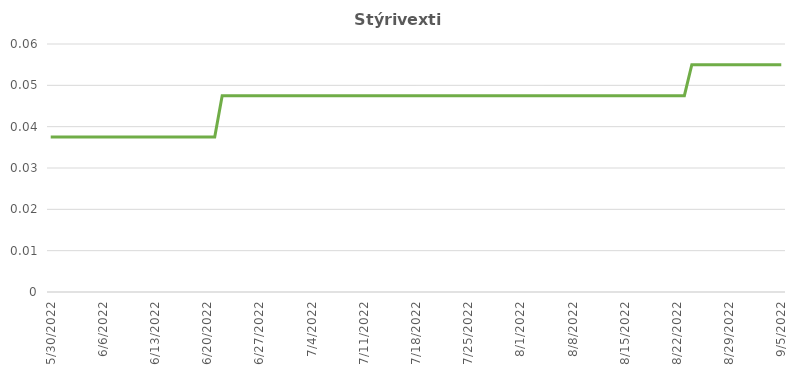
| Category | Stýrivextir |
|---|---|
| 9/5/22 | 0.055 |
| 9/2/22 | 0.055 |
| 9/1/22 | 0.055 |
| 8/31/22 | 0.055 |
| 8/30/22 | 0.055 |
| 8/29/22 | 0.055 |
| 8/26/22 | 0.055 |
| 8/25/22 | 0.055 |
| 8/24/22 | 0.055 |
| 8/23/22 | 0.048 |
| 8/22/22 | 0.048 |
| 8/19/22 | 0.048 |
| 8/18/22 | 0.048 |
| 8/17/22 | 0.048 |
| 8/16/22 | 0.048 |
| 8/15/22 | 0.048 |
| 8/12/22 | 0.048 |
| 8/11/22 | 0.048 |
| 8/10/22 | 0.048 |
| 8/9/22 | 0.048 |
| 8/8/22 | 0.048 |
| 8/5/22 | 0.048 |
| 8/4/22 | 0.048 |
| 8/3/22 | 0.048 |
| 8/2/22 | 0.048 |
| 7/29/22 | 0.048 |
| 7/28/22 | 0.048 |
| 7/27/22 | 0.048 |
| 7/26/22 | 0.048 |
| 7/25/22 | 0.048 |
| 7/22/22 | 0.048 |
| 7/21/22 | 0.048 |
| 7/20/22 | 0.048 |
| 7/19/22 | 0.048 |
| 7/18/22 | 0.048 |
| 7/15/22 | 0.048 |
| 7/14/22 | 0.048 |
| 7/13/22 | 0.048 |
| 7/12/22 | 0.048 |
| 7/11/22 | 0.048 |
| 7/8/22 | 0.048 |
| 7/7/22 | 0.048 |
| 7/6/22 | 0.048 |
| 7/5/22 | 0.048 |
| 7/4/22 | 0.048 |
| 7/1/22 | 0.048 |
| 6/30/22 | 0.048 |
| 6/29/22 | 0.048 |
| 6/28/22 | 0.048 |
| 6/27/22 | 0.048 |
| 6/24/22 | 0.048 |
| 6/23/22 | 0.048 |
| 6/22/22 | 0.048 |
| 6/21/22 | 0.038 |
| 6/20/22 | 0.038 |
| 6/16/22 | 0.038 |
| 6/15/22 | 0.038 |
| 6/14/22 | 0.038 |
| 6/13/22 | 0.038 |
| 6/10/22 | 0.038 |
| 6/9/22 | 0.038 |
| 6/8/22 | 0.038 |
| 6/7/22 | 0.038 |
| 6/3/22 | 0.038 |
| 6/2/22 | 0.038 |
| 6/1/22 | 0.038 |
| 5/31/22 | 0.038 |
| 5/30/22 | 0.038 |